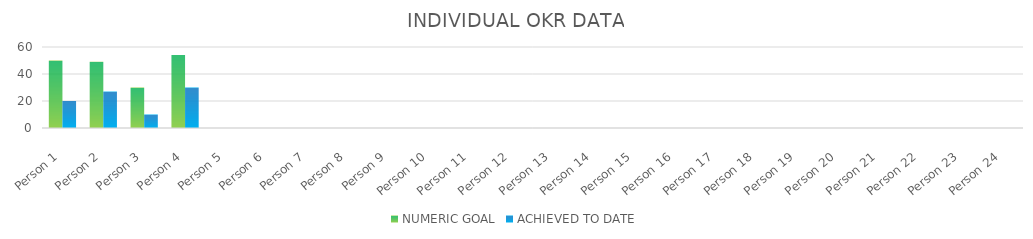
| Category | NUMERIC GOAL | ACHIEVED TO DATE |
|---|---|---|
| Person 1 | 50 | 20 |
| Person 2 | 49 | 27 |
| Person 3 | 30 | 10 |
| Person 4 | 54 | 30 |
| Person 5 | 0 | 0 |
| Person 6 | 0 | 0 |
| Person 7 | 0 | 0 |
| Person 8 | 0 | 0 |
| Person 9 | 0 | 0 |
| Person 10 | 0 | 0 |
| Person 11 | 0 | 0 |
| Person 12 | 0 | 0 |
| Person 13 | 0 | 0 |
| Person 14 | 0 | 0 |
| Person 15 | 0 | 0 |
| Person 16 | 0 | 0 |
| Person 17 | 0 | 0 |
| Person 18 | 0 | 0 |
| Person 19 | 0 | 0 |
| Person 20 | 0 | 0 |
| Person 21 | 0 | 0 |
| Person 22 | 0 | 0 |
| Person 23 | 0 | 0 |
| Person 24 | 0 | 0 |